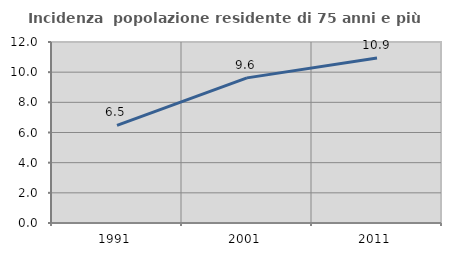
| Category | Incidenza  popolazione residente di 75 anni e più |
|---|---|
| 1991.0 | 6.468 |
| 2001.0 | 9.621 |
| 2011.0 | 10.936 |